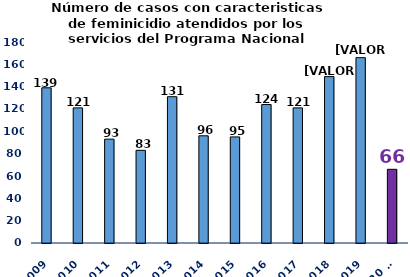
| Category | Feminicidio |
|---|---|
| 2009 | 139 |
| 2010 | 121 |
| 2011 | 93 |
| 2012 | 83 |
| 2013 | 131 |
| 2014 | 96 |
| 2015 | 95 |
| 2016 | 124 |
| 2017 | 121 |
| 2018 | 149 |
| 2019 | 166 |
| 2020 a/ | 66 |